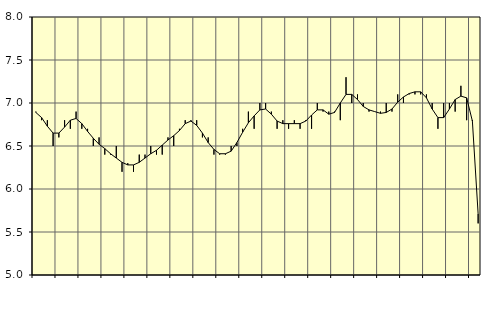
| Category | Piggar | Transport, SNI 49-53 |
|---|---|---|
| nan | 6.9 | 6.89 |
| 1.0 | 6.8 | 6.83 |
| 1.0 | 6.8 | 6.73 |
| 1.0 | 6.5 | 6.65 |
| nan | 6.6 | 6.65 |
| 2.0 | 6.8 | 6.72 |
| 2.0 | 6.7 | 6.8 |
| 2.0 | 6.9 | 6.82 |
| nan | 6.7 | 6.76 |
| 3.0 | 6.7 | 6.67 |
| 3.0 | 6.5 | 6.59 |
| 3.0 | 6.6 | 6.52 |
| nan | 6.4 | 6.47 |
| 4.0 | 6.4 | 6.41 |
| 4.0 | 6.5 | 6.36 |
| 4.0 | 6.2 | 6.31 |
| nan | 6.3 | 6.28 |
| 5.0 | 6.2 | 6.28 |
| 5.0 | 6.4 | 6.31 |
| 5.0 | 6.4 | 6.36 |
| nan | 6.5 | 6.41 |
| 6.0 | 6.4 | 6.45 |
| 6.0 | 6.4 | 6.51 |
| 6.0 | 6.6 | 6.57 |
| nan | 6.5 | 6.62 |
| 7.0 | 6.7 | 6.68 |
| 7.0 | 6.8 | 6.76 |
| 7.0 | 6.8 | 6.79 |
| nan | 6.8 | 6.74 |
| 8.0 | 6.6 | 6.65 |
| 8.0 | 6.6 | 6.54 |
| 8.0 | 6.4 | 6.46 |
| nan | 6.4 | 6.41 |
| 9.0 | 6.4 | 6.41 |
| 9.0 | 6.5 | 6.44 |
| 9.0 | 6.5 | 6.54 |
| nan | 6.7 | 6.66 |
| 10.0 | 6.9 | 6.77 |
| 10.0 | 6.7 | 6.85 |
| 10.0 | 7 | 6.92 |
| nan | 7 | 6.93 |
| 11.0 | 6.9 | 6.87 |
| 11.0 | 6.7 | 6.79 |
| 11.0 | 6.8 | 6.76 |
| nan | 6.7 | 6.76 |
| 12.0 | 6.8 | 6.76 |
| 12.0 | 6.7 | 6.76 |
| 12.0 | 6.8 | 6.79 |
| nan | 6.7 | 6.86 |
| 13.0 | 7 | 6.92 |
| 13.0 | 6.9 | 6.92 |
| 13.0 | 6.9 | 6.87 |
| nan | 6.9 | 6.89 |
| 14.0 | 6.8 | 7 |
| 14.0 | 7.3 | 7.1 |
| 14.0 | 7 | 7.1 |
| nan | 7.1 | 7.04 |
| 15.0 | 7 | 6.96 |
| 15.0 | 6.9 | 6.92 |
| 15.0 | 6.9 | 6.9 |
| nan | 6.9 | 6.88 |
| 16.0 | 7 | 6.89 |
| 16.0 | 6.9 | 6.93 |
| 16.0 | 7.1 | 7.01 |
| nan | 7 | 7.07 |
| 17.0 | 7.1 | 7.11 |
| 17.0 | 7.1 | 7.13 |
| 17.0 | 7.1 | 7.13 |
| nan | 7.1 | 7.06 |
| 18.0 | 7 | 6.93 |
| 18.0 | 6.7 | 6.83 |
| 18.0 | 7 | 6.83 |
| nan | 7 | 6.93 |
| 19.0 | 6.9 | 7.04 |
| 19.0 | 7.2 | 7.08 |
| 19.0 | 6.8 | 7.06 |
| nan | 6.8 | 6.79 |
| 20.0 | 5.6 | 5.71 |